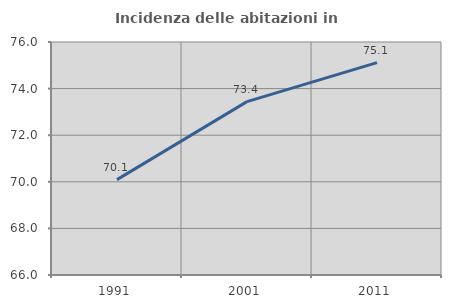
| Category | Incidenza delle abitazioni in proprietà  |
|---|---|
| 1991.0 | 70.093 |
| 2001.0 | 73.442 |
| 2011.0 | 75.115 |